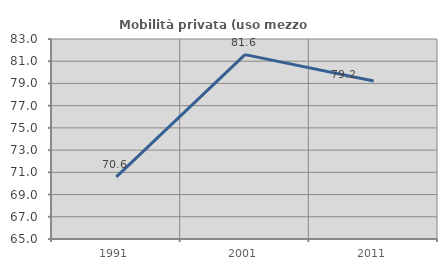
| Category | Mobilità privata (uso mezzo privato) |
|---|---|
| 1991.0 | 70.588 |
| 2001.0 | 81.595 |
| 2011.0 | 79.213 |